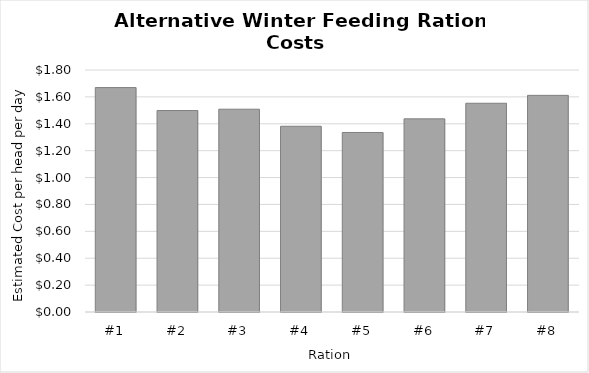
| Category | Series 0 |
|---|---|
| #1 | 1.669 |
| #2 | 1.498 |
| #3 | 1.508 |
| #4 | 1.381 |
| #5 | 1.335 |
| #6 | 1.437 |
| #7 | 1.553 |
| #8 | 1.611 |